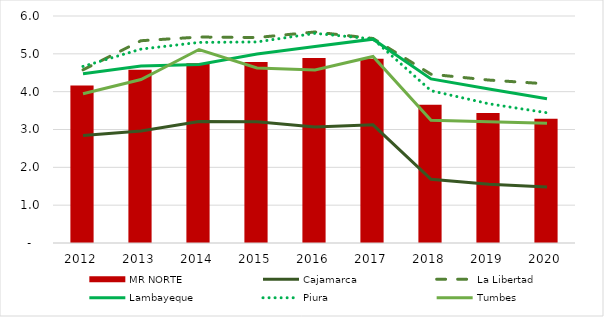
| Category | MR NORTE |
|---|---|
| 0 | 4.16 |
| 1 | 4.577 |
| 2 | 4.748 |
| 3 | 4.783 |
| 4 | 4.892 |
| 5 | 4.869 |
| 6 | 3.654 |
| 7 | 3.438 |
| 8 | 3.282 |